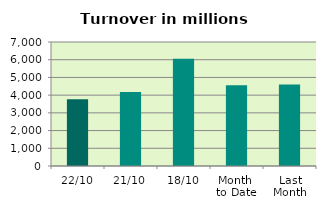
| Category | Series 0 |
|---|---|
| 22/10 | 3768.586 |
| 21/10 | 4176.328 |
| 18/10 | 6060.739 |
| Month 
to Date | 4557.024 |
| Last
Month | 4598.075 |